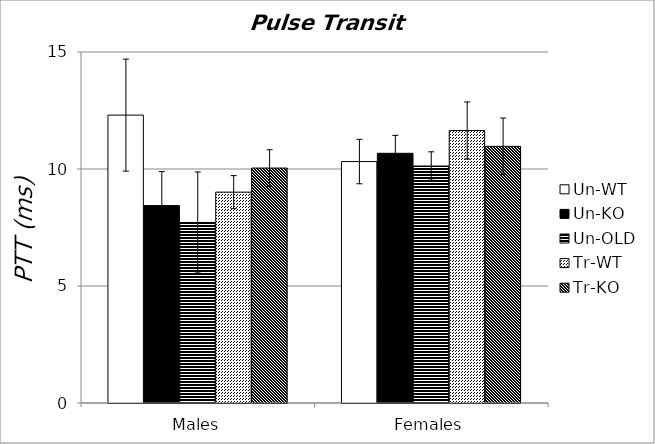
| Category | Un-WT | Un-KO | Un-OLD | Tr-WT | Tr-KO |
|---|---|---|---|---|---|
| 0 | 12.303 | 8.436 | 7.714 | 9.011 | 10.04 |
| 1 | 10.318 | 10.671 | 10.128 | 11.645 | 10.969 |